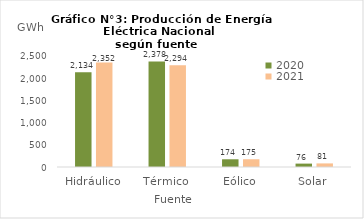
| Category | 2020 | 2021 |
|---|---|---|
| Hidráulico | 2133.661 | 2351.818 |
| Térmico | 2377.661 | 2294.285 |
| Eólico | 174.101 | 174.55 |
| Solar | 76.363 | 80.833 |